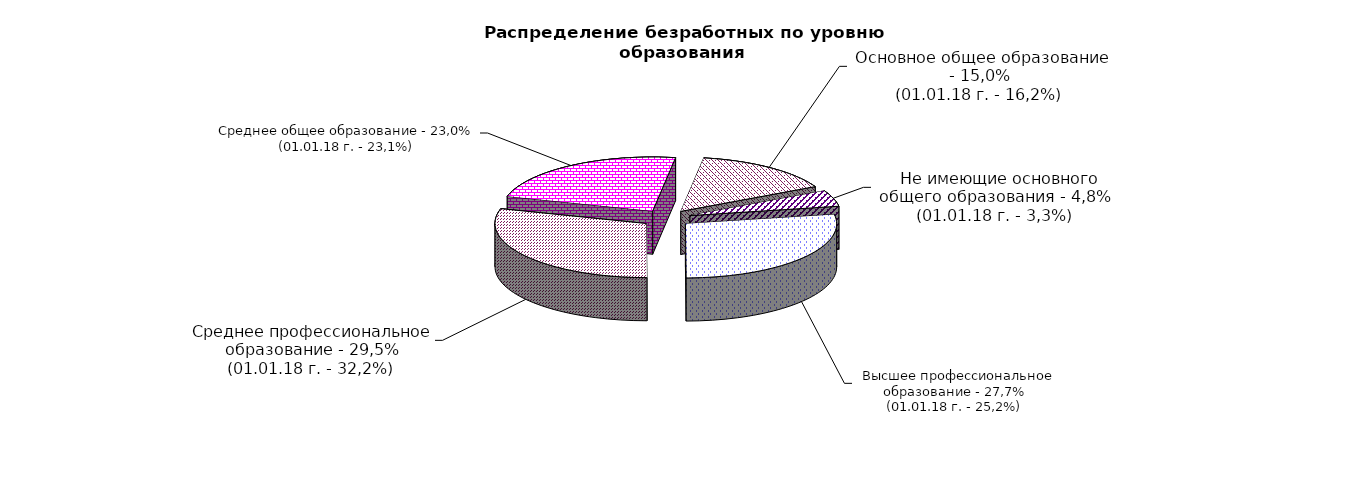
| Category | Series 0 |
|---|---|
|  - высшее профессиональное образование | 27.7 |
|  - среднее профессиональное образование | 29.5 |
|  - среднее общее образование | 23 |
|  - основное общее образование | 15 |
|  - не имеющие основного общего образования | 4.8 |